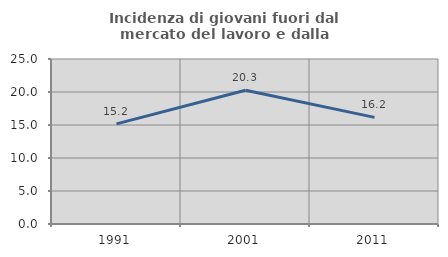
| Category | Incidenza di giovani fuori dal mercato del lavoro e dalla formazione  |
|---|---|
| 1991.0 | 15.163 |
| 2001.0 | 20.264 |
| 2011.0 | 16.159 |